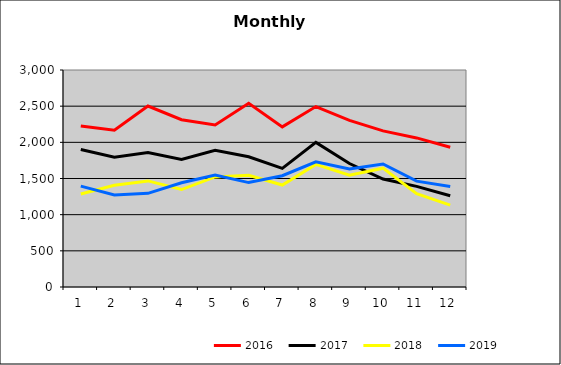
| Category | 2016 | 2017 | 2018 | 2019 |
|---|---|---|---|---|
| 0 | 2226.188 | 1900.859 | 1286.21 | 1394.576 |
| 1 | 2166.497 | 1795.105 | 1406.556 | 1272.617 |
| 2 | 2501.903 | 1859.386 | 1466.695 | 1295.231 |
| 3 | 2312.349 | 1764.013 | 1347.408 | 1441.267 |
| 4 | 2240.561 | 1891.399 | 1522.181 | 1548.691 |
| 5 | 2540.235 | 1800.236 | 1543.945 | 1443.46 |
| 6 | 2213.485 | 1640.121 | 1409.491 | 1538.112 |
| 7 | 2494.361 | 1999.331 | 1694.901 | 1729.426 |
| 8 | 2304.009 | 1706.874 | 1545.104 | 1631.933 |
| 9 | 2158.544 | 1492.036 | 1642.816 | 1701.214 |
| 10 | 2060.966 | 1390.86 | 1288.934 | 1463.951 |
| 11 | 1932.97 | 1261.902 | 1131.485 | 1390.399 |